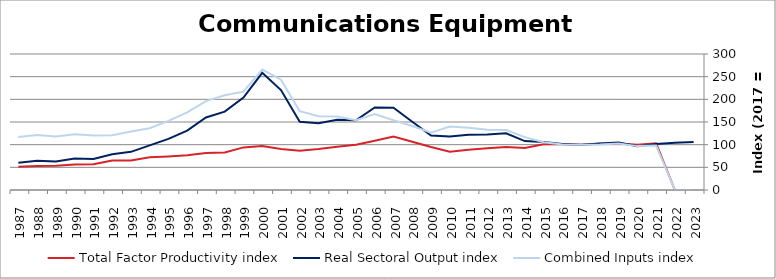
| Category | Total Factor Productivity index | Real Sectoral Output index | Combined Inputs index |
|---|---|---|---|
| 2023.0 | 0 | 105.825 | 0 |
| 2022.0 | 0 | 103.987 | 0 |
| 2021.0 | 103.154 | 101.224 | 98.129 |
| 2020.0 | 99.699 | 96.496 | 96.788 |
| 2019.0 | 102.572 | 104.944 | 102.312 |
| 2018.0 | 102.184 | 102.622 | 100.429 |
| 2017.0 | 100 | 100 | 100 |
| 2016.0 | 100.86 | 101.35 | 100.485 |
| 2015.0 | 100.649 | 106.013 | 105.33 |
| 2014.0 | 92.499 | 107.855 | 116.601 |
| 2013.0 | 94.639 | 125.256 | 132.352 |
| 2012.0 | 92.135 | 122.237 | 132.672 |
| 2011.0 | 89.006 | 122.075 | 137.155 |
| 2010.0 | 84.391 | 118.06 | 139.896 |
| 2009.0 | 94.844 | 119.95 | 126.471 |
| 2008.0 | 106.512 | 150.447 | 141.249 |
| 2007.0 | 118.057 | 181.54 | 153.773 |
| 2006.0 | 108.673 | 182.042 | 167.513 |
| 2005.0 | 99.934 | 153.853 | 153.954 |
| 2004.0 | 95.513 | 154.775 | 162.046 |
| 2003.0 | 90.493 | 147.458 | 162.95 |
| 2002.0 | 86.464 | 150.281 | 173.808 |
| 2001.0 | 90.684 | 220.553 | 243.21 |
| 2000.0 | 97.225 | 258.464 | 265.84 |
| 1999.0 | 93.957 | 203.872 | 216.985 |
| 1998.0 | 82.657 | 172.786 | 209.041 |
| 1997.0 | 81.608 | 159.982 | 196.038 |
| 1996.0 | 76.537 | 131.101 | 171.291 |
| 1995.0 | 73.993 | 112.857 | 152.523 |
| 1994.0 | 72.173 | 98.418 | 136.363 |
| 1993.0 | 65.257 | 84.201 | 129.029 |
| 1992.0 | 65.074 | 78.733 | 120.989 |
| 1991.0 | 56.639 | 68.205 | 120.42 |
| 1990.0 | 56.38 | 69.415 | 123.12 |
| 1989.0 | 53.228 | 62.727 | 117.846 |
| 1988.0 | 52.941 | 64.247 | 121.355 |
| 1987.0 | 51.251 | 59.913 | 116.901 |